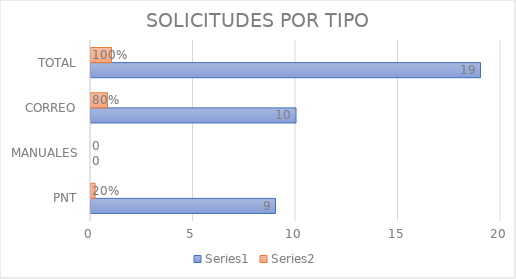
| Category | Series 0 | Series 1 |
|---|---|---|
| PNT | 9 | 0.2 |
| MANUALES | 0 | 0 |
| CORREO | 10 | 0.8 |
| TOTAL | 19 | 1 |